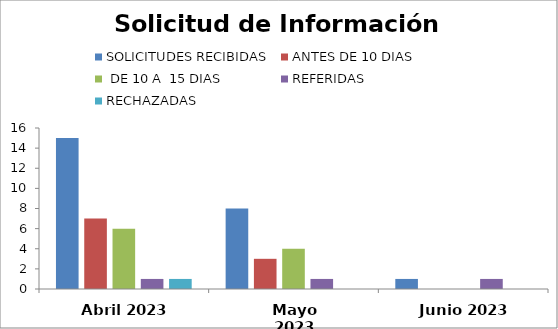
| Category | SOLICITUDES RECIBIDAS | ANTES DE 10 DIAS |  DE 10 A  15 DIAS  | REFERIDAS | RECHAZADAS |
|---|---|---|---|---|---|
| Abril 2023 | 15 | 7 | 6 | 1 | 1 |
| Mayo 2023 | 8 | 3 | 4 | 1 | 0 |
| Junio 2023 | 1 | 0 | 0 | 1 | 0 |